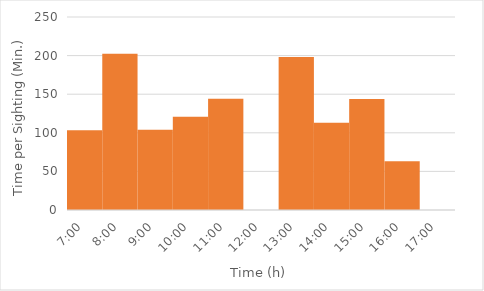
| Category | Time/Sightings |
|---|---|
| 7:00 | 103.333 |
| 8:00 | 202.5 |
| 9:00 | 104.091 |
| 10:00 | 120.75 |
| 11:00 | 144 |
| 12:00 | 0 |
| 13:00 | 198.25 |
| 14:00 | 112.9 |
| 15:00 | 143.833 |
| 16:00 | 63 |
| 17:00 | 0 |